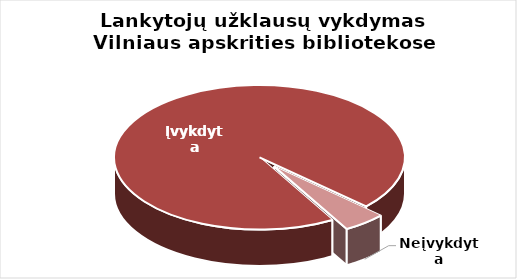
| Category | Series 0 |
|---|---|
| Įvykdyta | 417758 |
| Neįvykdyta | 20913 |